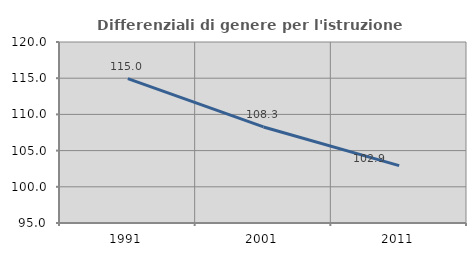
| Category | Differenziali di genere per l'istruzione superiore |
|---|---|
| 1991.0 | 114.952 |
| 2001.0 | 108.266 |
| 2011.0 | 102.926 |